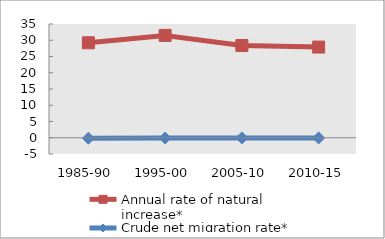
| Category | Annual rate of natural increase* | Crude net migration rate* |
|---|---|---|
| 1985-90 | 29.223 | -0.149 |
| 1995-00 | 31.486 | -0.082 |
| 2005-10 | 28.389 | -0.051 |
| 2010-15 | 27.901 | -0.044 |